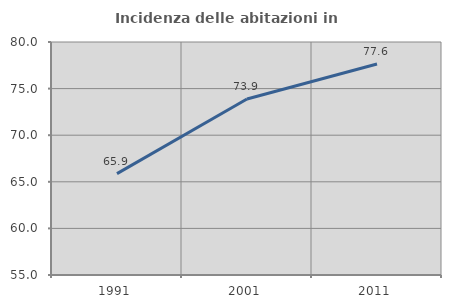
| Category | Incidenza delle abitazioni in proprietà  |
|---|---|
| 1991.0 | 65.879 |
| 2001.0 | 73.878 |
| 2011.0 | 77.641 |